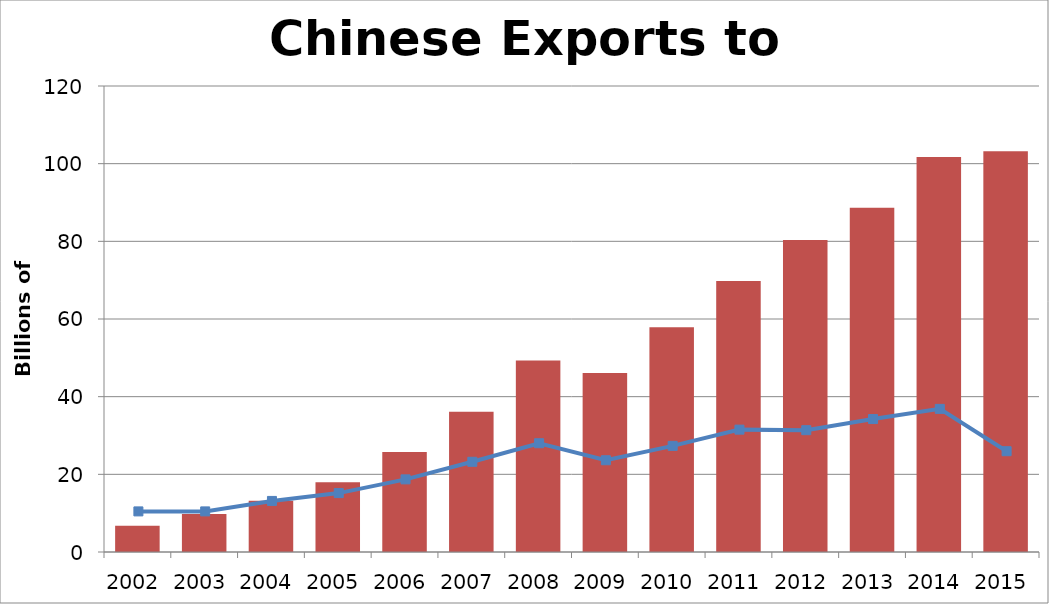
| Category | Chinese Exports to Africa |
|---|---|
| 2002.0 | 6.736 |
| 2003.0 | 9.803 |
| 2004.0 | 13.22 |
| 2005.0 | 17.931 |
| 2006.0 | 25.781 |
| 2007.0 | 36.145 |
| 2008.0 | 49.341 |
| 2009.0 | 46.101 |
| 2010.0 | 57.875 |
| 2011.0 | 69.809 |
| 2012.0 | 80.343 |
| 2013.0 | 88.625 |
| 2014.0 | 101.699 |
| 2015.0 | 103.191 |